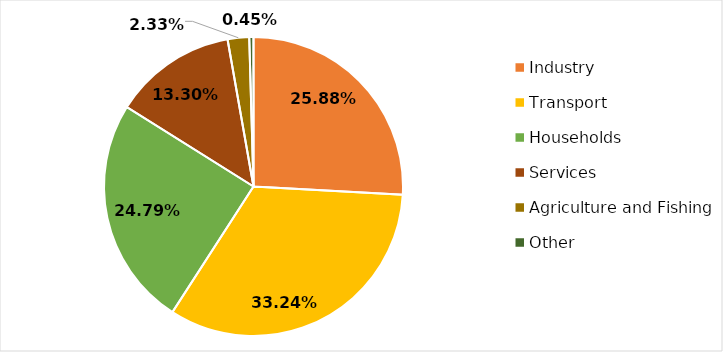
| Category | Series 0 |
|---|---|
| Industry | 0.259 |
| Transport | 0.332 |
| Households | 0.248 |
| Services | 0.133 |
| Agriculture and Fishing | 0.023 |
| Other | 0.005 |